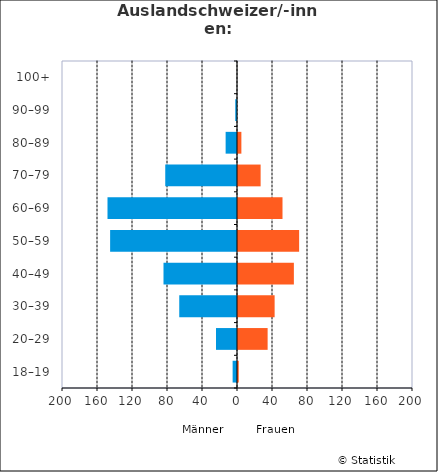
| Category | Männer | Frauen |
|---|---|---|
| 18–19 | -5 | 2 |
| 20–29 | -24 | 35 |
| 30–39 | -66 | 43 |
| 40–49 | -84 | 65 |
| 50–59 | -145 | 71 |
| 60–69 | -148 | 52 |
| 70–79 | -82 | 27 |
| 80–89 | -13 | 5 |
| 90–99 | -2 | 0 |
| 100+ | 0 | 0 |